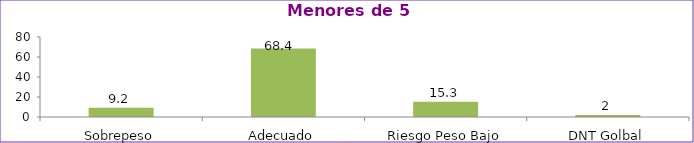
| Category | Series 0 |
|---|---|
| Sobrepeso | 9.2 |
| Adecuado | 68.4 |
| Riesgo Peso Bajo | 15.3 |
| DNT Golbal | 2 |